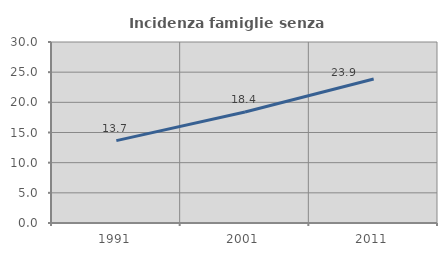
| Category | Incidenza famiglie senza nuclei |
|---|---|
| 1991.0 | 13.652 |
| 2001.0 | 18.387 |
| 2011.0 | 23.866 |